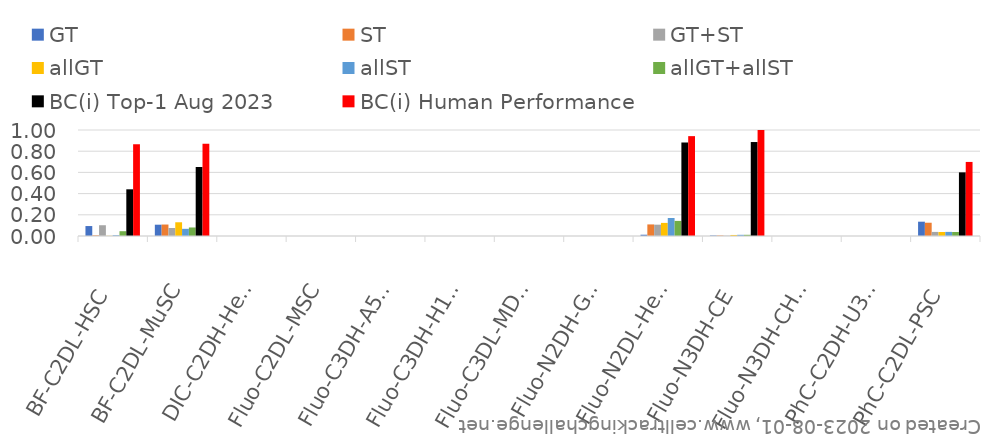
| Category | GT | ST | GT+ST | allGT | allST | allGT+allST | BC(i) Top-1 Aug 2023 | BC(i) Human Performance |
|---|---|---|---|---|---|---|---|---|
| BF-C2DL-HSC | 0.094 | 0.006 | 0.102 | 0.002 | 0.008 | 0.045 | 0.44 | 0.866 |
| BF-C2DL-MuSC | 0.107 | 0.108 | 0.076 | 0.13 | 0.068 | 0.08 | 0.651 | 0.87 |
| DIC-C2DH-HeLa | 0 | 0 | 0 | 0 | 0 | 0 | 0 | 0 |
| Fluo-C2DL-MSC | 0 | 0 | 0 | 0 | 0 | 0 | 0 | 0 |
| Fluo-C3DH-A549 | 0 | 0 | 0 | 0 | 0 | 0 | 0 | 0 |
| Fluo-C3DH-H157 | 0 | 0 | 0 | 0 | 0 | 0 | 0 | 0 |
| Fluo-C3DL-MDA231 | 0 | 0 | 0 | 0 | 0 | 0 | 0 | 0 |
| Fluo-N2DH-GOWT1 | 0 | 0 | 0 | 0 | 0 | 0 | 0 | 0 |
| Fluo-N2DL-HeLa | 0.012 | 0.109 | 0.107 | 0.124 | 0.17 | 0.142 | 0.882 | 0.942 |
| Fluo-N3DH-CE | 0.005 | 0.005 | 0.003 | 0.01 | 0.011 | 0.011 | 0.887 | 1 |
| Fluo-N3DH-CHO | 0 | 0 | 0 | 0 | 0 | 0 | 0 | 0 |
| PhC-C2DH-U373 | 0 | 0 | 0 | 0 | 0 | 0 | 0 | 0 |
| PhC-C2DL-PSC | 0.135 | 0.125 | 0.039 | 0.038 | 0.039 | 0.037 | 0.6 | 0.699 |